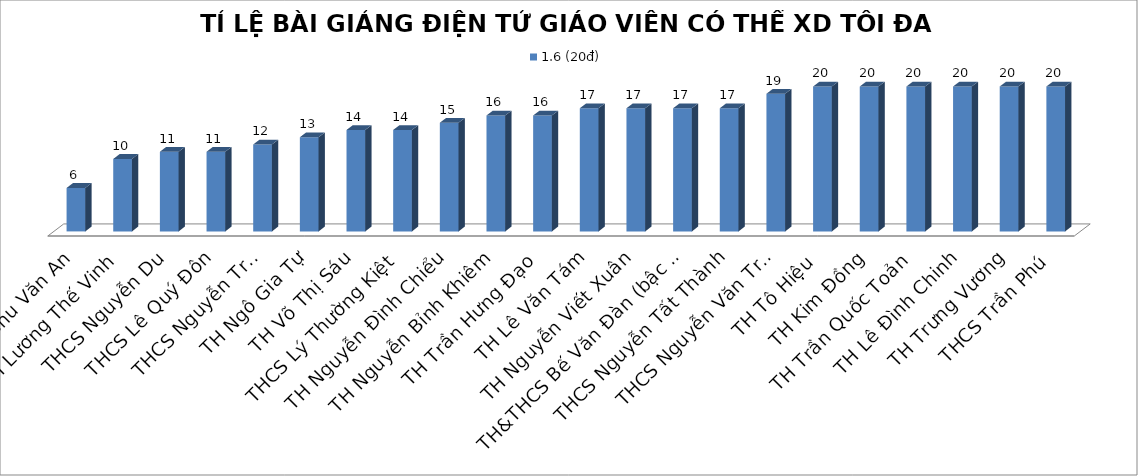
| Category | 1.6 (20đ) |
|---|---|
| TH Chu Văn An | 6 |
| TH Lương Thế Vinh | 10 |
| THCS Nguyễn Du | 11 |
| THCS Lê Quý Đôn | 11 |
| THCS Nguyễn Trãi | 12 |
| TH Ngô Gia Tự | 13 |
| TH Võ Thị Sáu | 14 |
| THCS Lý Thường Kiệt | 14 |
| TH Nguyễn Đình Chiểu | 15 |
| TH Nguyễn Bỉnh Khiêm | 16 |
| TH Trần Hưng Đạo | 16 |
| TH Lê Văn Tám | 17 |
| TH Nguyễn Viết Xuân | 17 |
| TH&THCS Bế Văn Đàn (bậc TH, THCS) | 17 |
| THCS Nguyễn Tất Thành | 17 |
| THCS Nguyễn Văn Trỗi | 19 |
| TH Tô Hiệu | 20 |
| TH Kim Đồng | 20 |
| TH Trần Quốc Toản | 20 |
| TH Lê Đình Chinh | 20 |
| TH Trưng Vương | 20 |
| THCS Trần Phú | 20 |